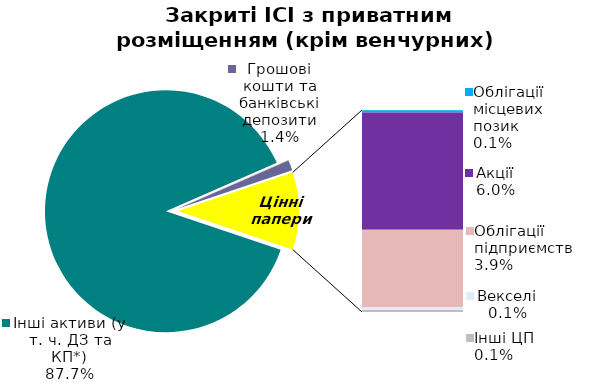
| Category | Series 0 |
|---|---|
| Інші активи (у т. ч. ДЗ та КП*) | 0.877 |
| Нерухомість | 0 |
| Грошові кошти та банківські депозити | 0.014 |
| Банківські метали | 0 |
| Облігації державні (у т.ч. ОВДП) | 0 |
| Облігації місцевих позик | 0.001 |
| Акції | 0.06 |
| Облігації підприємств | 0.039 |
| Векселі | 0.001 |
| Інші ЦП  | 0.001 |